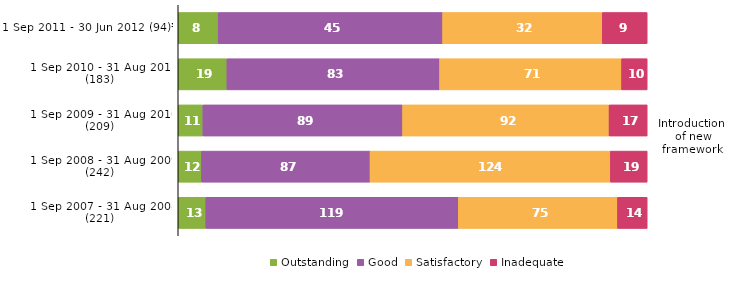
| Category | Outstanding | Good | Satisfactory | Inadequate |
|---|---|---|---|---|
| 1 Sep 2011 - 30 Jun 2012 (94)³ | 8 | 45 | 32 | 9 |
| 1 Sep 2010 - 31 Aug 2011 (183) | 19 | 83 | 71 | 10 |
| 1 Sep 2009 - 31 Aug 2010 (209) | 11 | 89 | 92 | 17 |
| 1 Sep 2008 - 31 Aug 2009 (242) | 12 | 87 | 124 | 19 |
| 1 Sep 2007 - 31 Aug 2008 (221) | 13 | 119 | 75 | 14 |